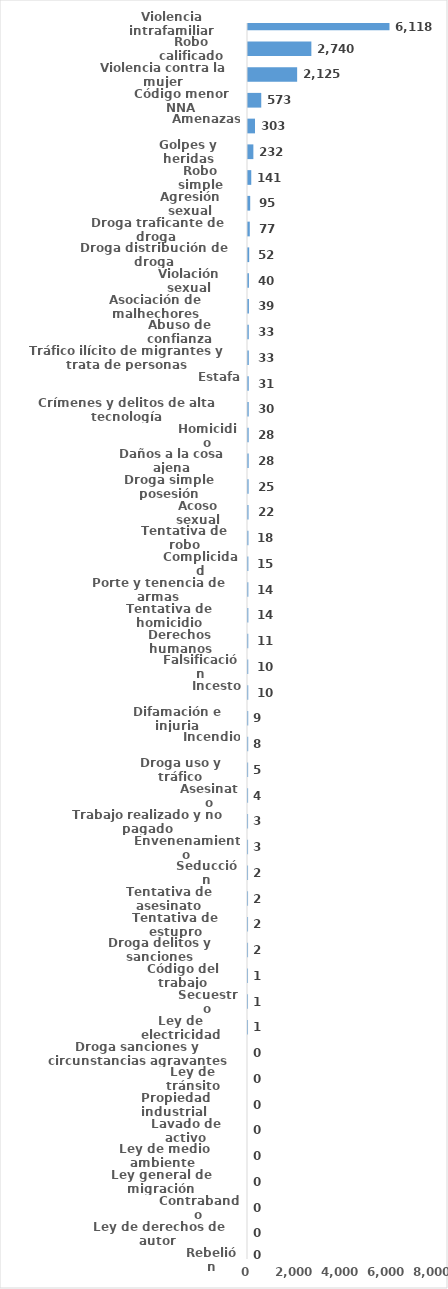
| Category | Series 0 |
|---|---|
| Violencia intrafamiliar | 6118 |
| Robo calificado | 2740 |
| Violencia contra la mujer | 2125 |
| Código menor NNA | 573 |
| Amenazas | 303 |
| Golpes y heridas | 232 |
| Robo simple | 141 |
| Agresión sexual | 95 |
| Droga traficante de droga  | 77 |
| Droga distribución de droga | 52 |
| Violación sexual | 40 |
| Asociación de malhechores | 39 |
| Abuso de confianza | 33 |
| Tráfico ilícito de migrantes y trata de personas | 33 |
| Estafa | 31 |
| Crímenes y delitos de alta tecnología | 30 |
| Homicidio | 28 |
| Daños a la cosa ajena | 28 |
| Droga simple posesión | 25 |
| Acoso sexual | 22 |
| Tentativa de robo | 18 |
| Complicidad | 15 |
| Porte y tenencia de armas | 14 |
| Tentativa de homicidio | 14 |
| Derechos humanos | 11 |
| Falsificación | 10 |
| Incesto | 10 |
| Difamación e injuria | 9 |
| Incendio | 8 |
| Droga uso y tráfico | 5 |
| Asesinato | 4 |
| Trabajo realizado y no pagado | 3 |
| Envenenamiento | 3 |
| Seducción | 2 |
| Tentativa de asesinato | 2 |
| Tentativa de estupro | 2 |
| Droga delitos y sanciones | 2 |
| Código del trabajo | 1 |
| Secuestro | 1 |
| Ley de electricidad | 1 |
| Droga sanciones y circunstancias agravantes | 0 |
| Ley de tránsito | 0 |
| Propiedad industrial  | 0 |
| Lavado de activo | 0 |
| Ley de medio ambiente  | 0 |
| Ley general de migración | 0 |
| Contrabando | 0 |
| Ley de derechos de autor  | 0 |
| Rebelión | 0 |